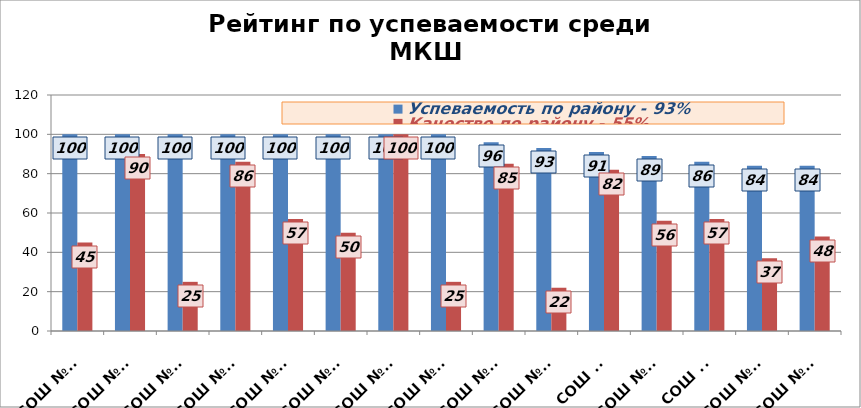
| Category | Успеваемость по району - 93% | Качество по району - 55% |
|---|---|---|
| СОШ №15 | 100 | 45 |
| СОШ №16 | 100 | 90 |
| СОШ №17 | 100 | 25 |
| СОШ №18 | 100 | 86 |
| СОШ №21 | 100 | 57 |
| СОШ №26 | 100 | 50 |
| СОШ №27 | 100 | 100 |
| СОШ №31 | 100 | 25 |
| СОШ №10 | 96 | 85 |
| СОШ №24 | 93 | 22 |
| СОШ №9 | 91 | 82 |
| СОШ №28 | 89 | 56 |
| СОШ №8 | 86 | 57 |
| СОШ №14 | 84 | 37 |
| СОШ №22 | 84 | 48 |